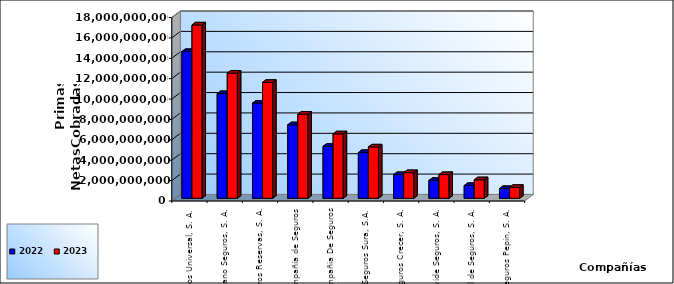
| Category | 2022 | 2023 |
|---|---|---|
| Seguros Universal, S. A. | 14397968189.86 | 17005919116.88 |
| Humano Seguros, S. A. | 10267448063.45 | 12279639730.91 |
| Seguros Reservas, S. A. | 9336609770 | 11372048660.37 |
| Mapfre BHD Compañía de Seguros | 7213550634.35 | 8252193836.81 |
| La Colonial, S. A., Compañia De Seguros | 5100032308.3 | 6321615901.76 |
| Seguros Sura, S.A. | 4488799032.83 | 5037958047.02 |
| Seguros Crecer, S. A. | 2324097833.06 | 2516796731.25 |
| Worldwide Seguros, S. A. | 1748919736.86 | 2326163081.87 |
| General de Seguros, S. A. | 1256039535.41 | 1817766024.83 |
| Seguros Pepín, S. A. | 953828913.98 | 1073644923.45 |